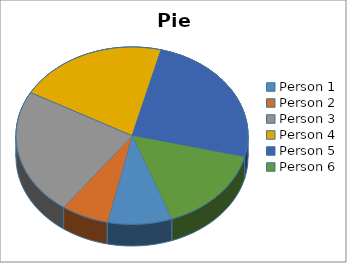
| Category | Pie Chart |
|---|---|
| Person 1 | 248 |
| Person 2 | 183 |
| Person 3 | 638 |
| Person 4 | 579 |
| Person 5 | 687 |
| Person 6 | 431 |